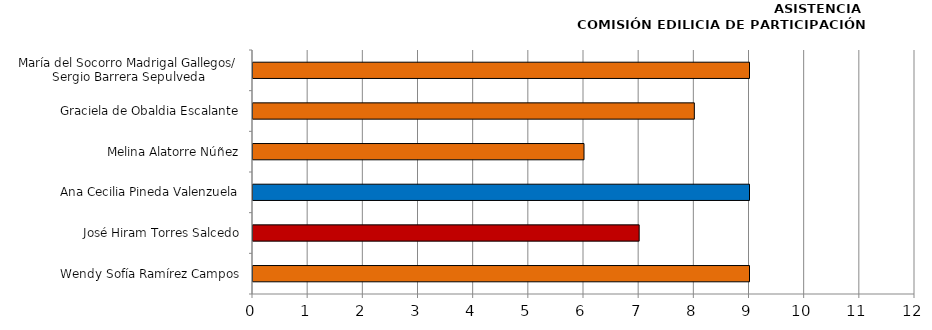
| Category | Series 0 |
|---|---|
| Wendy Sofía Ramírez Campos | 9 |
| José Hiram Torres Salcedo | 7 |
| Ana Cecilia Pineda Valenzuela | 9 |
| Melina Alatorre Núñez | 6 |
| Graciela de Obaldia Escalante | 8 |
| María del Socorro Madrigal Gallegos/
Sergio Barrera Sepulveda | 9 |